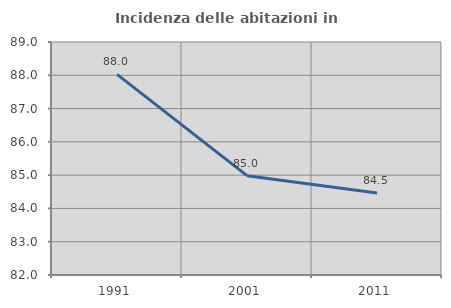
| Category | Incidenza delle abitazioni in proprietà  |
|---|---|
| 1991.0 | 88.028 |
| 2001.0 | 84.984 |
| 2011.0 | 84.466 |